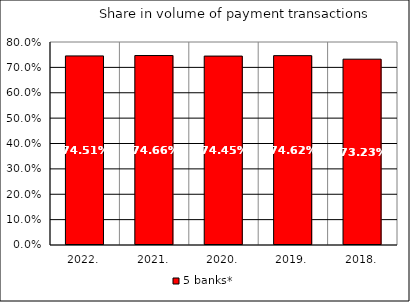
| Category | 5 banks* |
|---|---|
| 2022. | 0.745 |
| 2021. | 0.747 |
| 2020. | 0.744 |
| 2019. | 0.746 |
| 2018. | 0.732 |